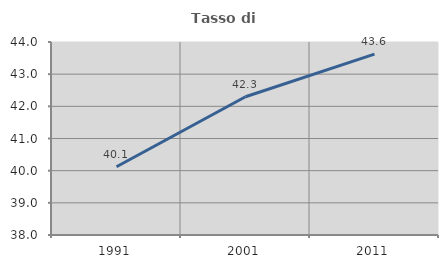
| Category | Tasso di occupazione   |
|---|---|
| 1991.0 | 40.122 |
| 2001.0 | 42.299 |
| 2011.0 | 43.624 |